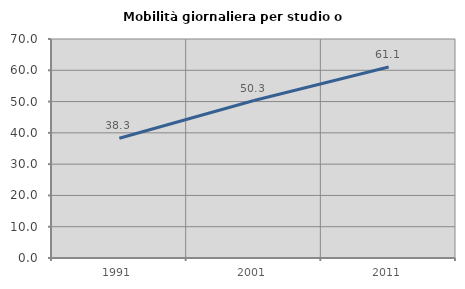
| Category | Mobilità giornaliera per studio o lavoro |
|---|---|
| 1991.0 | 38.274 |
| 2001.0 | 50.336 |
| 2011.0 | 61.062 |